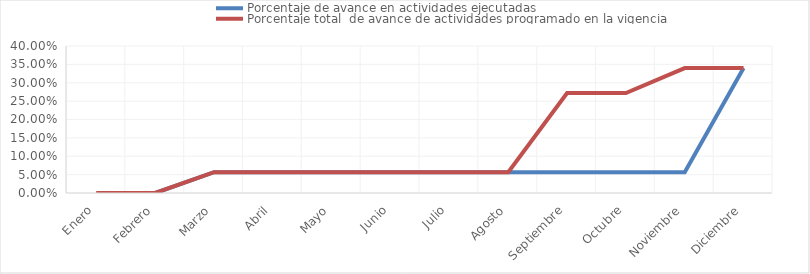
| Category | Porcentaje de avance en actividades ejecutadas | Porcentaje total  de avance de actividades programado en la vigencia |
|---|---|---|
| 0 | 0 | 0 |
| 1 | 0 | 0 |
| 2 | 0.057 | 0.057 |
| 3 | 0.057 | 0.057 |
| 4 | 0.057 | 0.057 |
| 5 | 0.057 | 0.057 |
| 6 | 0.057 | 0.057 |
| 7 | 0.057 | 0.057 |
| 8 | 0.057 | 0.272 |
| 9 | 0.057 | 0.272 |
| 10 | 0.057 | 0.34 |
| 11 | 0.34 | 0.34 |